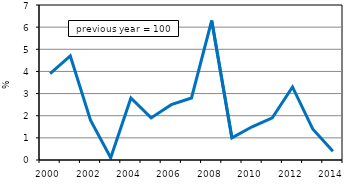
| Category | Series 0 |
|---|---|
| 2000.0 | 3.9 |
| 2001.0 | 4.7 |
| 2002.0 | 1.8 |
| 2003.0 | 0.1 |
| 2004.0 | 2.8 |
| 2005.0 | 1.9 |
| 2006.0 | 2.5 |
| 2007.0 | 2.8 |
| 2008.0 | 6.3 |
| 2009.0 | 1 |
| 2010.0 | 1.5 |
| 2011.0 | 1.9 |
| 2012.0 | 3.3 |
| 2013.0 | 1.4 |
| 2014.0 | 0.4 |